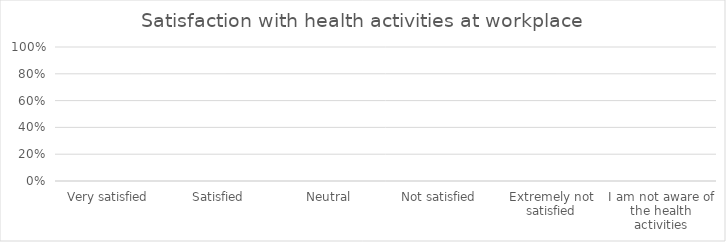
| Category | Series 0 |
|---|---|
| Very satisfied | 0 |
| Satisfied | 0 |
| Neutral | 0 |
| Not satisfied | 0 |
| Extremely not satisfied | 0 |
| I am not aware of the health activities | 0 |